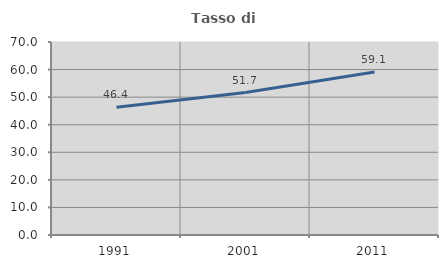
| Category | Tasso di occupazione   |
|---|---|
| 1991.0 | 46.364 |
| 2001.0 | 51.683 |
| 2011.0 | 59.143 |